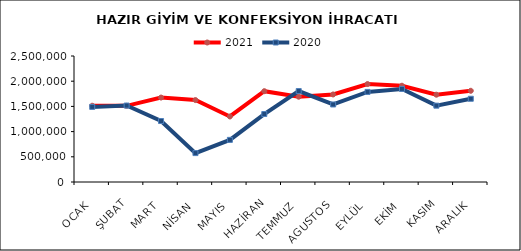
| Category | 2021 | 2020 |
|---|---|---|
| OCAK | 1512838.093 | 1490291.142 |
| ŞUBAT | 1510533.645 | 1516896.937 |
| MART | 1675068.109 | 1209723.862 |
| NİSAN | 1625655.53 | 573299.876 |
| MAYIS | 1299897.652 | 835944.778 |
| HAZİRAN | 1801990.151 | 1348615.769 |
| TEMMUZ | 1692319.294 | 1804537.191 |
| AGUSTOS | 1736869.432 | 1538137.829 |
| EYLÜL | 1943585.948 | 1787531.543 |
| EKİM | 1910046.254 | 1846829.93 |
| KASIM | 1732006.686 | 1514539.334 |
| ARALIK | 1809626.977 | 1651689.073 |